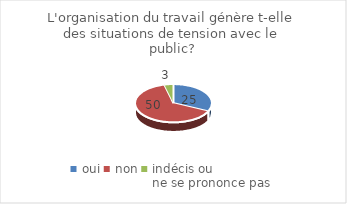
| Category | L'organisation du travail génère t-elle des situations de tension avec le public? |
|---|---|
| oui | 25 |
| non | 50 |
| indécis ou 
ne se prononce pas | 3 |